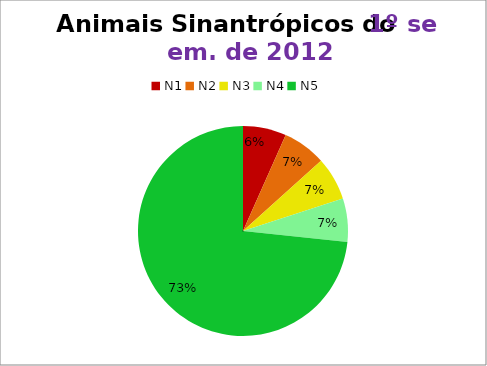
| Category | 1º/12 |
|---|---|
| N1 | 2 |
| N2 | 2 |
| N3 | 2 |
| N4 | 2 |
| N5 | 22 |